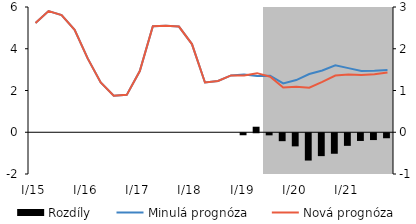
| Category | Rozdíly |
|---|---|
| I/15 | 0 |
| II | 0 |
| III | 0 |
| IV | 0 |
| I/16 | 0 |
| II | 0 |
| III | 0 |
| IV | 0 |
| I/17 | 0 |
| II | 0 |
| III | 0 |
| IV | 0 |
| I/18 | 0 |
| II | 0 |
| III | 0 |
| IV | 0 |
| I/19 | -0.048 |
| II | 0.132 |
| III | -0.05 |
| IV | -0.19 |
| I/20 | -0.314 |
| II | -0.654 |
| III | -0.548 |
| IV | -0.491 |
| I/21 | -0.302 |
| II | -0.185 |
| III | -0.163 |
| IV | -0.12 |